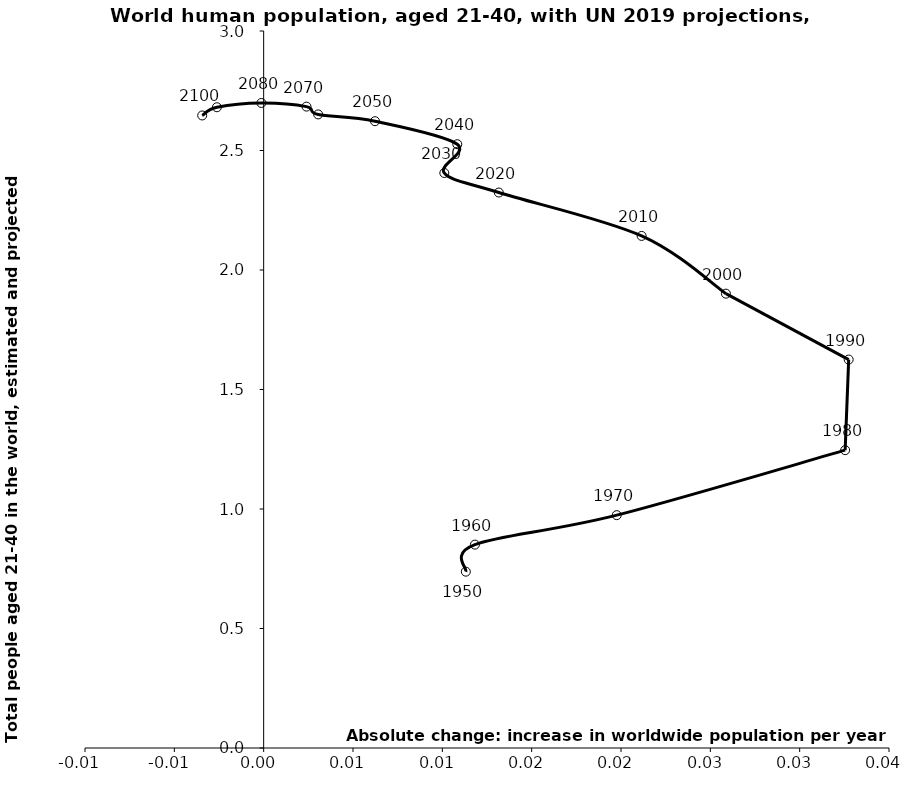
| Category | Series 0 |
|---|---|
| 0.011315642000000015 | 0.738 |
| 0.011823938849999998 | 0.851 |
| 0.01976164605000001 | 0.974 |
| 0.03254634825000002 | 1.246 |
| 0.03274320999999998 | 1.625 |
| 0.02587191759999997 | 1.901 |
| 0.021153610400000012 | 2.143 |
| 0.01316164875000001 | 2.324 |
| 0.010112099250000006 | 2.406 |
| 0.010836312000000037 | 2.526 |
| 0.0062318990000000294 | 2.623 |
| 0.0030500735999999585 | 2.651 |
| 0.0023974813999999346 | 2.684 |
| -0.0001284121999999721 | 2.699 |
| -0.0026164610999999784 | 2.681 |
| -0.003441041700000058 | 2.647 |